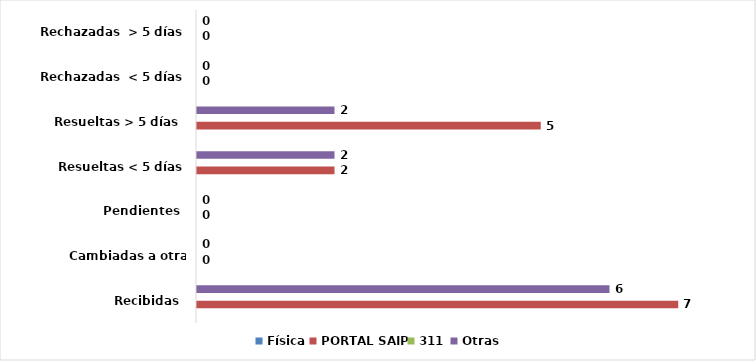
| Category | Física | PORTAL SAIP | 311 | Otras |
|---|---|---|---|---|
| Recibidas  | 0 | 7 | 0 | 6 |
| Cambiadas a otra institución | 0 | 0 | 0 | 0 |
| Pendientes  | 0 | 0 | 0 | 0 |
| Resueltas < 5 días | 0 | 2 | 0 | 2 |
| Resueltas > 5 días  | 0 | 5 | 0 | 2 |
| Rechazadas  < 5 días | 0 | 0 | 0 | 0 |
| Rechazadas  > 5 días | 0 | 0 | 0 | 0 |